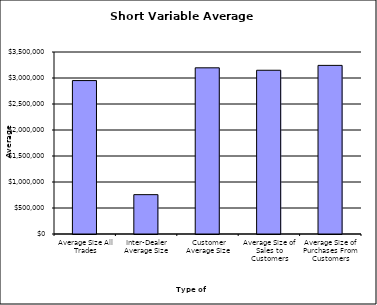
| Category | Security Type |
|---|---|
| Average Size All Trades | 2950563.37 |
| Inter-Dealer Average Size | 756701.915 |
| Customer Average Size | 3195733.13 |
| Average Size of Sales to Customers | 3148749.917 |
| Average Size of Purchases From Customers | 3242578.617 |